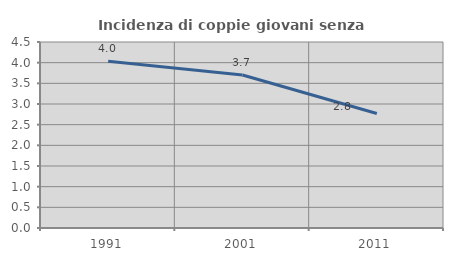
| Category | Incidenza di coppie giovani senza figli |
|---|---|
| 1991.0 | 4.032 |
| 2001.0 | 3.701 |
| 2011.0 | 2.771 |